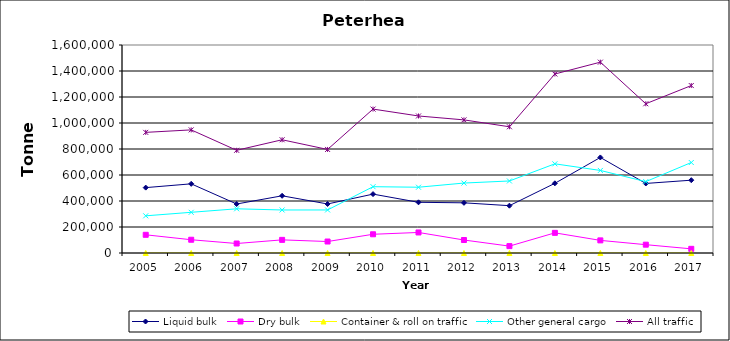
| Category | Liquid bulk | Dry bulk | Container & roll on traffic | Other general cargo | All traffic |
|---|---|---|---|---|---|
| 2005.0 | 503000 | 140000 | 0 | 286000 | 928000 |
| 2006.0 | 532000 | 102000 | 0 | 313000 | 947000 |
| 2007.0 | 377000 | 73000 | 0 | 340000 | 790000 |
| 2008.0 | 440000 | 101000 | 0 | 331000 | 871000 |
| 2009.0 | 377249 | 88298 | 0 | 331033 | 796580 |
| 2010.0 | 453000 | 144000 | 0 | 510000 | 1107000 |
| 2011.0 | 390000 | 158000 | 0 | 506000 | 1054000 |
| 2012.0 | 386000 | 100000 | 0 | 538000 | 1024000 |
| 2013.0 | 364000 | 53000 | 0 | 554000 | 971000 |
| 2014.0 | 536000 | 155000 | 0 | 686000 | 1377000 |
| 2015.0 | 735000 | 97000 | 0 | 635000 | 1468000 |
| 2016.0 | 535000 | 64000 | 0 | 549000 | 1148000 |
| 2017.0 | 560000 | 32000 | 0 | 696000 | 1288000 |